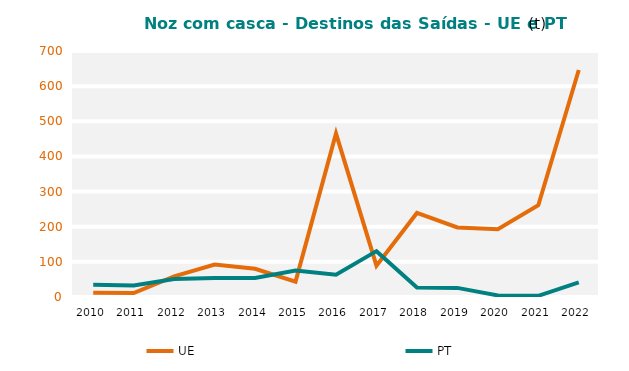
| Category | UE | PT |
|---|---|---|
| 2010.0 | 12.264 | 34.884 |
| 2011.0 | 11.202 | 33.03 |
| 2012.0 | 58.743 | 50.924 |
| 2013.0 | 92.196 | 54.144 |
| 2014.0 | 80.261 | 54.121 |
| 2015.0 | 43.703 | 75.549 |
| 2016.0 | 465.124 | 63.521 |
| 2017.0 | 89.132 | 130.484 |
| 2018.0 | 239.267 | 26.94 |
| 2019.0 | 197.897 | 25.897 |
| 2020.0 | 192.743 | 4.48 |
| 2021.0 | 261.047 | 3.466 |
| 2022.0 | 645.806 | 41.404 |